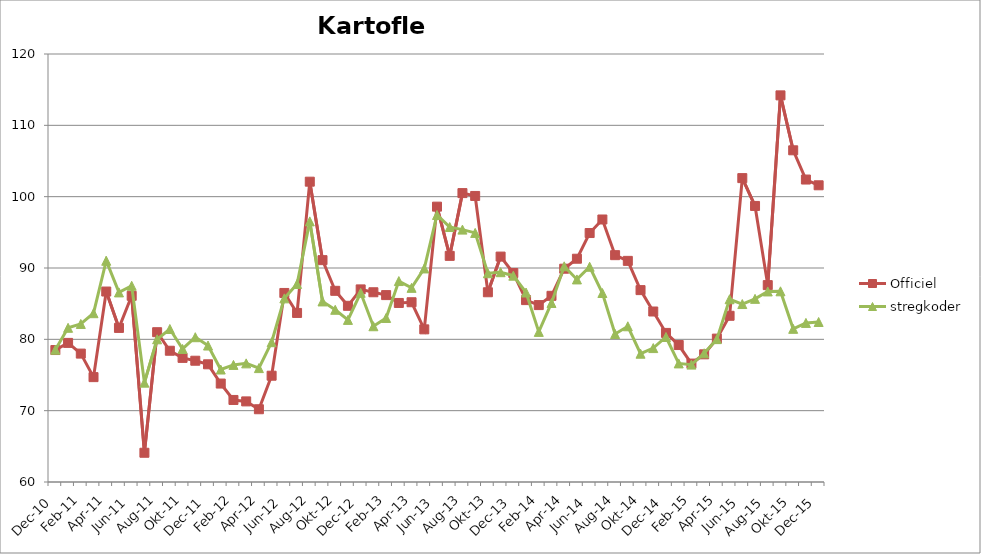
| Category | Officiel | stregkoder |
|---|---|---|
|  Dec-10 | 78.5 | 78.545 |
|  Jan-11 | 79.5 | 81.616 |
|  Feb-11 | 78 | 82.156 |
|  Mar-11 | 74.7 | 83.664 |
|  Apr-11 | 86.7 | 91.017 |
|  Maj-11 | 81.6 | 86.577 |
|  Jun-11 | 86.1 | 87.508 |
|  Jul-11 | 64.1 | 73.927 |
|  Aug-11 | 81 | 80.005 |
|  Sep-11 | 78.4 | 81.45 |
|  Okt-11 | 77.4 | 78.653 |
|  Nov-11 | 77 | 80.297 |
|  Dec-11 | 76.5 | 79.131 |
|  Jan-12 | 73.8 | 75.767 |
|  Feb-12 | 71.5 | 76.415 |
|  Mar-12 | 71.3 | 76.63 |
|  Apr-12 | 70.2 | 75.966 |
|  Maj-12 | 74.9 | 79.6 |
|  Jun-12 | 86.5 | 85.745 |
|  Jul-12 | 83.7 | 87.762 |
|  Aug-12 | 102.1 | 96.535 |
|  Sep-12 | 91.1 | 85.313 |
|  Okt-12 | 86.8 | 84.142 |
|  Nov-12 | 84.7 | 82.727 |
|  Dec-12 | 87 | 86.52 |
|  Jan-13 | 86.6 | 81.836 |
|  Feb-13 | 86.2 | 82.996 |
|  Mar-13 | 85.1 | 88.17 |
|  Apr-13 | 85.2 | 87.217 |
|  Maj-13 | 81.4 | 89.938 |
|  Jun-13 | 98.6 | 97.436 |
|  Jul-13 | 91.7 | 95.744 |
|  Aug-13 | 100.5 | 95.381 |
|  Sep-13 | 100.1 | 94.92 |
|  Okt-13 | 86.6 | 89.265 |
|  Nov-13 | 91.6 | 89.412 |
|  Dec-13 | 89.3 | 88.923 |
|  Jan-14 | 85.5 | 86.563 |
|  Feb-14 | 84.8 | 81.044 |
|  Mar-14 | 86.1 | 85.097 |
|  Apr-14 | 89.9 | 90.237 |
|  Maj-14 | 91.3 | 88.398 |
|  Jun-14 | 94.9 | 90.174 |
|  Jul-14 | 96.8 | 86.495 |
|  Aug-14 | 91.8 | 80.745 |
|  Sep-14 | 91 | 81.83 |
|  Okt-14 | 86.9 | 77.984 |
|  Nov-14 | 83.9 | 78.774 |
|  Dec-14 | 80.9 | 80.328 |
|  Jan-15 | 79.2 | 76.625 |
|  Feb-15 | 76.6 | 76.455 |
|  Mar-15 | 77.9 | 78.044 |
|  Apr-15 | 80.1 | 80.028 |
|  Maj-15 | 83.3 | 85.622 |
| Jun-15 | 102.6 | 84.947 |
| Jul-15 | 98.7 | 85.675 |
| Aug-15 | 87.6 | 86.713 |
| Sep-15 | 114.2 | 86.733 |
| Okt-15 | 106.5 | 81.472 |
| Nov-15 | 102.4 | 82.301 |
| Dec-15 | 101.595 | 82.431 |